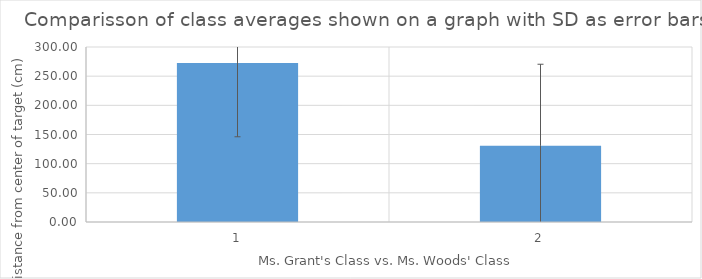
| Category | Series 0 |
|---|---|
| 0 | 272.625 |
| 1 | 130.611 |